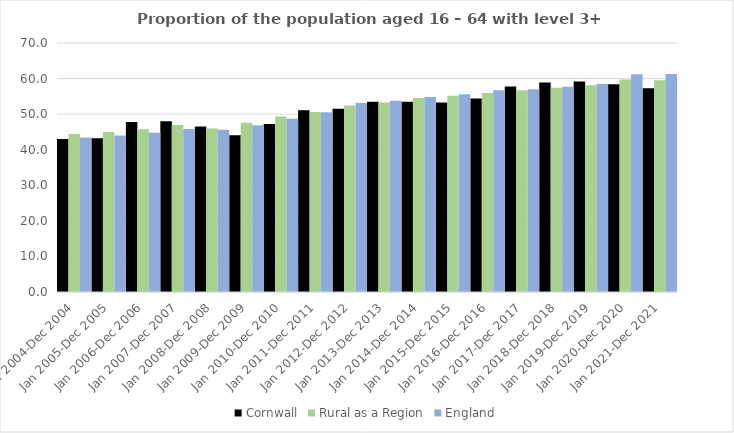
| Category | Cornwall | Rural as a Region | England |
|---|---|---|---|
| Jan 2004-Dec 2004 | 43 | 44.405 | 43.4 |
| Jan 2005-Dec 2005 | 43.2 | 44.973 | 44 |
| Jan 2006-Dec 2006 | 47.8 | 45.774 | 44.8 |
| Jan 2007-Dec 2007 | 48 | 46.968 | 45.8 |
| Jan 2008-Dec 2008 | 46.5 | 45.964 | 45.6 |
| Jan 2009-Dec 2009 | 44.1 | 47.59 | 46.9 |
| Jan 2010-Dec 2010 | 47.2 | 49.362 | 48.7 |
| Jan 2011-Dec 2011 | 51.1 | 50.602 | 50.5 |
| Jan 2012-Dec 2012 | 51.5 | 52.439 | 53.1 |
| Jan 2013-Dec 2013 | 53.5 | 53.276 | 53.8 |
| Jan 2014-Dec 2014 | 53.5 | 54.57 | 54.8 |
| Jan 2015-Dec 2015 | 53.3 | 55.16 | 55.6 |
| Jan 2016-Dec 2016 | 54.4 | 55.941 | 56.7 |
| Jan 2017-Dec 2017 | 57.8 | 56.689 | 57 |
| Jan 2018-Dec 2018 | 58.9 | 57.389 | 57.7 |
| Jan 2019-Dec 2019 | 59.2 | 58.147 | 58.5 |
| Jan 2020-Dec 2020 | 58.4 | 59.771 | 61.2 |
| Jan 2021-Dec 2021 | 57.3 | 59.54 | 61.3 |